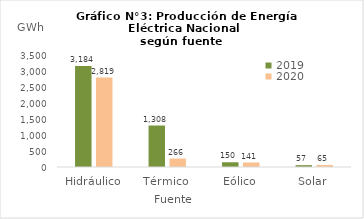
| Category | 2019 | 2020 |
|---|---|---|
| Hidráulico | 3183.595 | 2818.875 |
| Térmico | 1308.051 | 266.063 |
| Eólico | 149.654 | 141.381 |
| Solar | 57.145 | 64.588 |